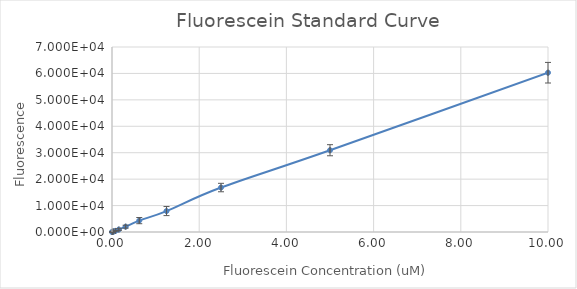
| Category | Series 0 |
|---|---|
| 10.0 | 60269.25 |
| 5.0 | 30940.25 |
| 2.5 | 16822 |
| 1.25 | 7917.75 |
| 0.625 | 4307.25 |
| 0.3125 | 2016.25 |
| 0.15625 | 934 |
| 0.078125 | 400.5 |
| 0.0390625 | 203.75 |
| 0.01953125 | 143.5 |
| 0.009765625 | 35.75 |
| 0.0 | 10.25 |